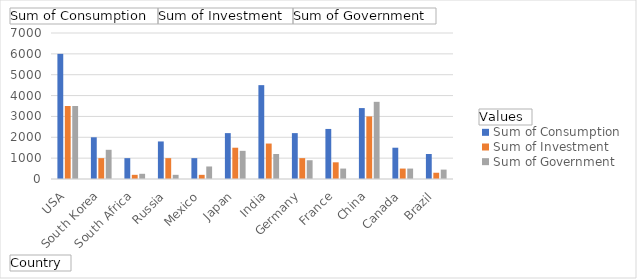
| Category | Sum of Consumption | Sum of Investment | Sum of Government |
|---|---|---|---|
| USA | 6000 | 3500 | 3500 |
| South Korea | 2000 | 1000 | 1400 |
| South Africa | 1000 | 200 | 250 |
| Russia | 1800 | 1000 | 200 |
| Mexico | 1000 | 200 | 600 |
| Japan | 2200 | 1500 | 1350 |
| India | 4500 | 1700 | 1200 |
| Germany | 2200 | 1000 | 900 |
| France | 2400 | 800 | 500 |
| China | 3400 | 3000 | 3700 |
| Canada | 1500 | 500 | 500 |
| Brazil | 1200 | 300 | 450 |